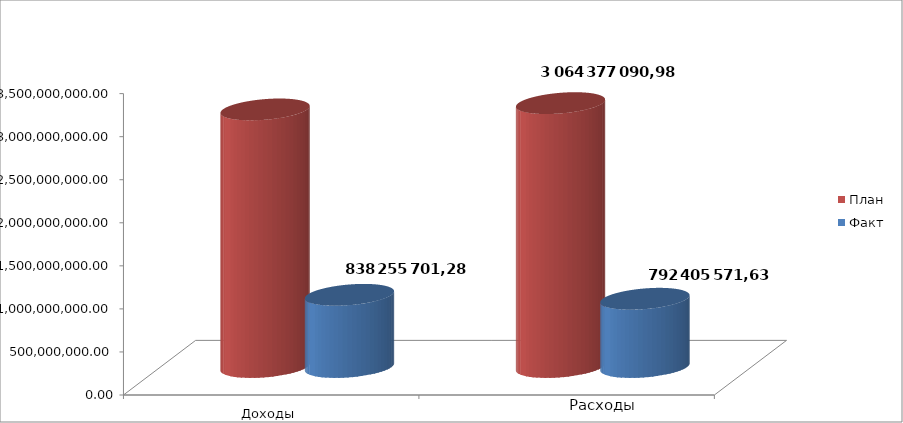
| Category | План | Факт |
|---|---|---|
| 0 | 2991144072.1 | 838255701.28 |
| 1 | 3064377090.98 | 792405571.63 |